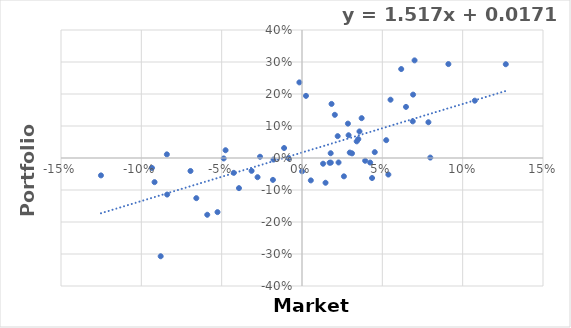
| Category | Series 0 |
|---|---|
| -0.04871929116215501 | -0.001 |
| -0.01771643248143373 | -0.005 |
| 0.031138913980379268 | 0.015 |
| 0.0647275128414313 | 0.16 |
| 0.002482323934879238 | 0.194 |
| 0.01464236088297044 | -0.077 |
| 0.03505157235872702 | 0.059 |
| -0.026112446646715304 | 0.004 |
| 0.06175283240005203 | 0.278 |
| -0.058971449299161094 | -0.177 |
| 0.053752860293699856 | -0.052 |
| 0.07986345457689326 | 0.001 |
| -0.09339570164348932 | -0.031 |
| -0.04244011921681046 | -0.046 |
| 0.09111634763220589 | 0.294 |
| -0.08391999322386645 | -0.114 |
| 5.324388360872234e-05 | -0.042 |
| -0.08795671914903935 | -0.307 |
| 0.03577323877328009 | 0.083 |
| -0.03136052086678265 | -0.04 |
| -0.05258508910699977 | -0.169 |
| 0.04361287497262989 | -0.063 |
| -0.00833373141847149 | -0.001 |
| 0.06914387330123462 | 0.198 |
| -0.047569140421166334 | 0.024 |
| 0.028990321391681118 | 0.071 |
| 0.02274810936591054 | -0.014 |
| 0.02221397632316946 | 0.068 |
| 0.005486502581813157 | -0.07 |
| 0.05242531255584737 | 0.056 |
| 0.04243863400810777 | -0.014 |
| 0.026091474971999817 | -0.057 |
| -0.011136640158463607 | 0.031 |
| 0.03712140665943231 | 0.124 |
| 0.10754565805086314 | 0.179 |
| -0.0276657746060065 | -0.06 |
| -0.0392279540954944 | -0.094 |
| 0.07006468732421922 | 0.305 |
| 0.0551012969754443 | 0.182 |
| 0.018388403283502663 | 0.169 |
| 0.04528177501261843 | 0.018 |
| 0.12684410293315374 | 0.293 |
| -0.12511932083595656 | -0.054 |
| -0.08411046900964814 | 0.011 |
| -0.001628089811129274 | 0.236 |
| 0.028589803182446305 | 0.107 |
| 0.03404706409091518 | 0.052 |
| 0.020431747482144935 | 0.135 |
| 0.017181167690656807 | -0.015 |
| -0.01809165274226776 | -0.068 |
| 0.013128195366039375 | -0.018 |
| 0.06893018320821498 | 0.115 |
| -0.06577772648116154 | -0.126 |
| 0.03931343494213935 | -0.009 |
| 0.01792428775107835 | -0.014 |
| 0.02972893014311606 | 0.017 |
| 0.07868440473103688 | 0.112 |
| -0.09177695576721734 | -0.075 |
| 0.01785938179914015 | 0.015 |
| -0.06940335897981464 | -0.041 |